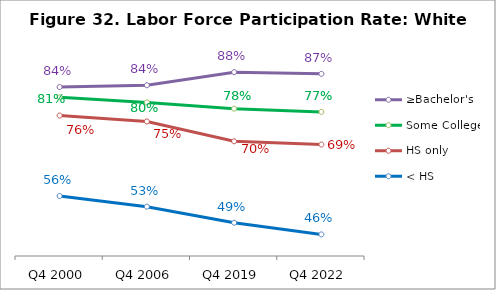
| Category | ≥Bachelor's | Some College | HS only | < HS |
|---|---|---|---|---|
| Q4 2000 | 0.837 | 0.81 | 0.763 | 0.555 |
| Q4 2006 | 0.842 | 0.797 | 0.748 | 0.528 |
| Q4 2019 | 0.875 | 0.781 | 0.697 | 0.486 |
| Q4 2022 | 0.871 | 0.773 | 0.688 | 0.456 |